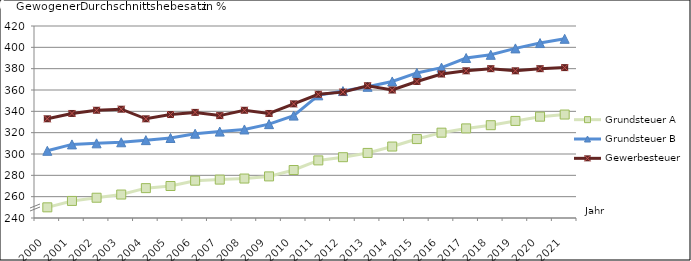
| Category | Grundsteuer A | Grundsteuer B | Gewerbesteuer |
|---|---|---|---|
| 2000.0 | 250 | 303 | 333 |
| 2001.0 | 256 | 309 | 338 |
| 2002.0 | 259 | 310 | 341 |
| 2003.0 | 262 | 311 | 342 |
| 2004.0 | 268 | 313 | 333 |
| 2005.0 | 270 | 315 | 337 |
| 2006.0 | 275 | 319 | 339 |
| 2007.0 | 276 | 321 | 336 |
| 2008.0 | 277 | 323 | 341 |
| 2009.0 | 279 | 328 | 338 |
| 2010.0 | 285 | 336 | 347 |
| 2011.0 | 294 | 355 | 356 |
| 2012.0 | 297 | 359 | 358 |
| 2013.0 | 301 | 363 | 364 |
| 2014.0 | 307 | 368 | 360 |
| 2015.0 | 314 | 376 | 368 |
| 2016.0 | 320 | 381 | 375 |
| 2017.0 | 324 | 390 | 378 |
| 2018.0 | 327 | 393 | 380 |
| 2019.0 | 331 | 399 | 378 |
| 2020.0 | 335 | 404 | 380 |
| 2021.0 | 337 | 408 | 381 |